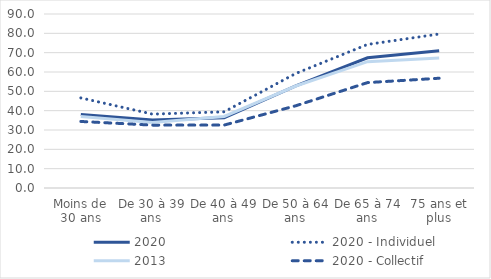
| Category | 2020 | 2020 - Individuel | 2013 | 2020 - Collectif |
|---|---|---|---|---|
| Moins de 30 ans | 37.958 | 46.602 | 37.028 | 34.414 |
| De 30 à 39 ans | 35.183 | 38.216 | 33.866 | 32.518 |
| De 40 à 49 ans | 36.388 | 39.406 | 37 | 32.548 |
| De 50 à 64 ans | 52.777 | 59.259 | 52.746 | 42.542 |
| De 65 à 74 ans | 67.321 | 74.248 | 65.33 | 54.512 |
| 75 ans et plus | 70.947 | 79.646 | 67.235 | 56.777 |